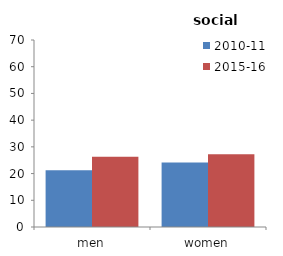
| Category | 2010-11 | 2015-16 |
|---|---|---|
| men | 21.233 | 26.328 |
| women | 24.112 | 27.199 |